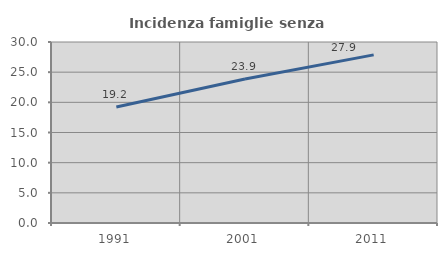
| Category | Incidenza famiglie senza nuclei |
|---|---|
| 1991.0 | 19.222 |
| 2001.0 | 23.859 |
| 2011.0 | 27.866 |